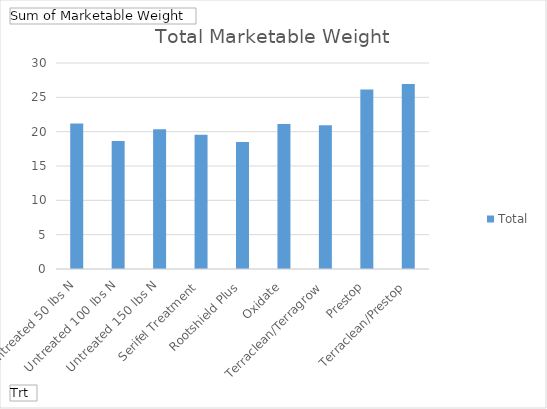
| Category | Total |
|---|---|
| Untreated 50 lbs N | 21.2 |
| Untreated 100 lbs N | 18.65 |
| Untreated 150 lbs N | 20.35 |
| Serifel Treatment | 19.55 |
| Rootshield Plus | 18.5 |
| Oxidate | 21.1 |
| Terraclean/Terragrow | 20.95 |
| Prestop | 26.15 |
| Terraclean/Prestop | 26.95 |